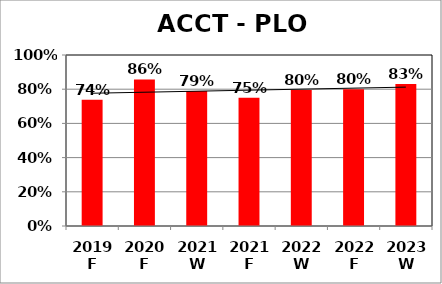
| Category | Series 0 |
|---|---|
| 2019 F | 0.738 |
| 2020 F | 0.857 |
| 2021 W | 0.79 |
| 2021 F | 0.75 |
| 2022 W | 0.795 |
| 2022 F | 0.8 |
| 2023 W | 0.83 |